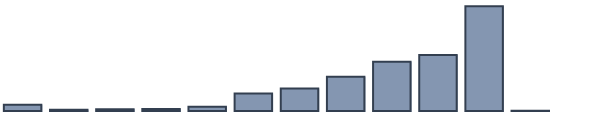
| Category | Series 0 |
|---|---|
| 0 | 2.1 |
| 1 | 0.4 |
| 2 | 0.6 |
| 3 | 0.7 |
| 4 | 1.4 |
| 5 | 5.8 |
| 6 | 7.5 |
| 7 | 11.4 |
| 8 | 16.4 |
| 9 | 18.7 |
| 10 | 34.9 |
| 11 | 0.1 |
| 12 | 0 |